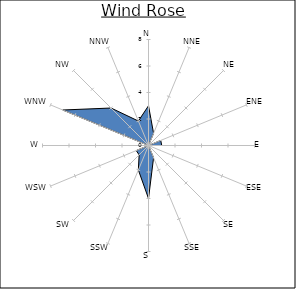
| Category | Series 0 |
|---|---|
| N | 3 |
| NNE | 1 |
| NE | 0 |
| ENE | 1 |
| E | 1 |
| ESE | 0 |
| SE | 0 |
| SSE | 1 |
| S | 4 |
| SSW | 2 |
| SW | 1 |
| WSW | 1 |
| W | 0 |
| WNW | 7 |
| NW | 4 |
| NNW | 2 |